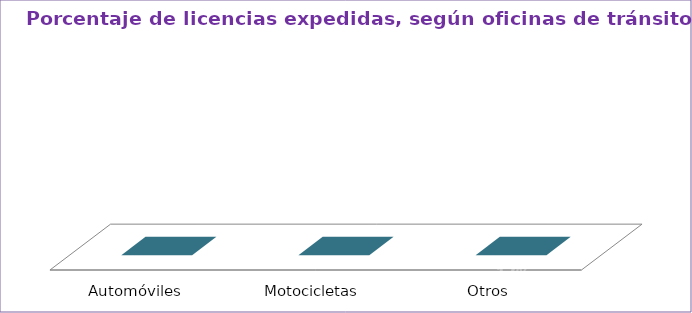
| Category | Series 0 |
|---|---|
| Automóviles  | 0 |
| Motocicletas  | 0 |
| Otros  | 0 |